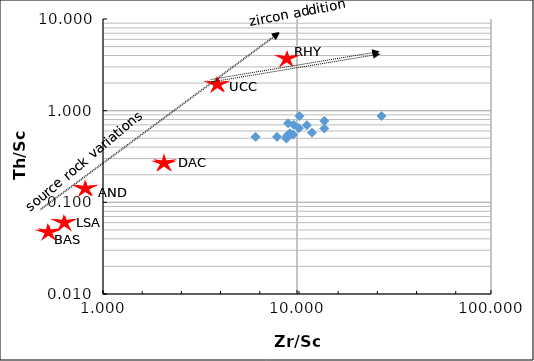
| Category | Series 0 |
|---|---|
| 9.625745562063964 | 0.701 |
| 13.830838024721455 | 0.639 |
| 9.547673289571478 | 0.547 |
| 8.866152611119592 | 0.528 |
| 7.893528889761808 | 0.518 |
| 13.832049870712174 | 0.773 |
| 8.814826094116603 | 0.496 |
| 6.113078918575498 | 0.519 |
| 10.231588156148307 | 0.644 |
| 9.20893323251604 | 0.565 |
| 27.266868113977722 | 0.875 |
| 9.065728493590022 | 0.552 |
| 11.245661419929109 | 0.695 |
| 8.996340845996725 | 0.729 |
| 10.30066154035683 | 0.87 |
| 11.948541058509344 | 0.575 |